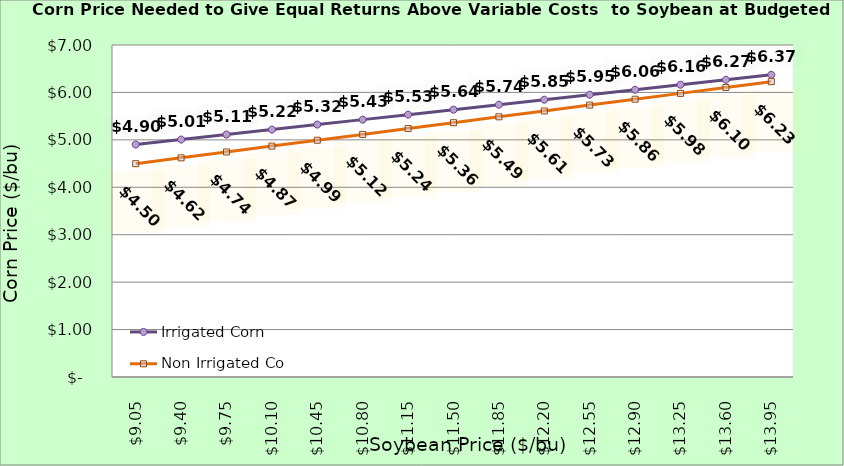
| Category | Irrigated Corn | Non Irrigated Corn |
|---|---|---|
| 9.050000000000002 | 4.902 | 4.498 |
| 9.400000000000002 | 5.007 | 4.621 |
| 9.750000000000002 | 5.112 | 4.745 |
| 10.100000000000001 | 5.217 | 4.868 |
| 10.450000000000001 | 5.322 | 4.992 |
| 10.8 | 5.427 | 5.115 |
| 11.15 | 5.532 | 5.239 |
| 11.5 | 5.637 | 5.362 |
| 11.85 | 5.742 | 5.486 |
| 12.2 | 5.847 | 5.609 |
| 12.549999999999999 | 5.952 | 5.733 |
| 12.899999999999999 | 6.057 | 5.856 |
| 13.249999999999998 | 6.162 | 5.98 |
| 13.599999999999998 | 6.267 | 6.103 |
| 13.949999999999998 | 6.372 | 6.227 |